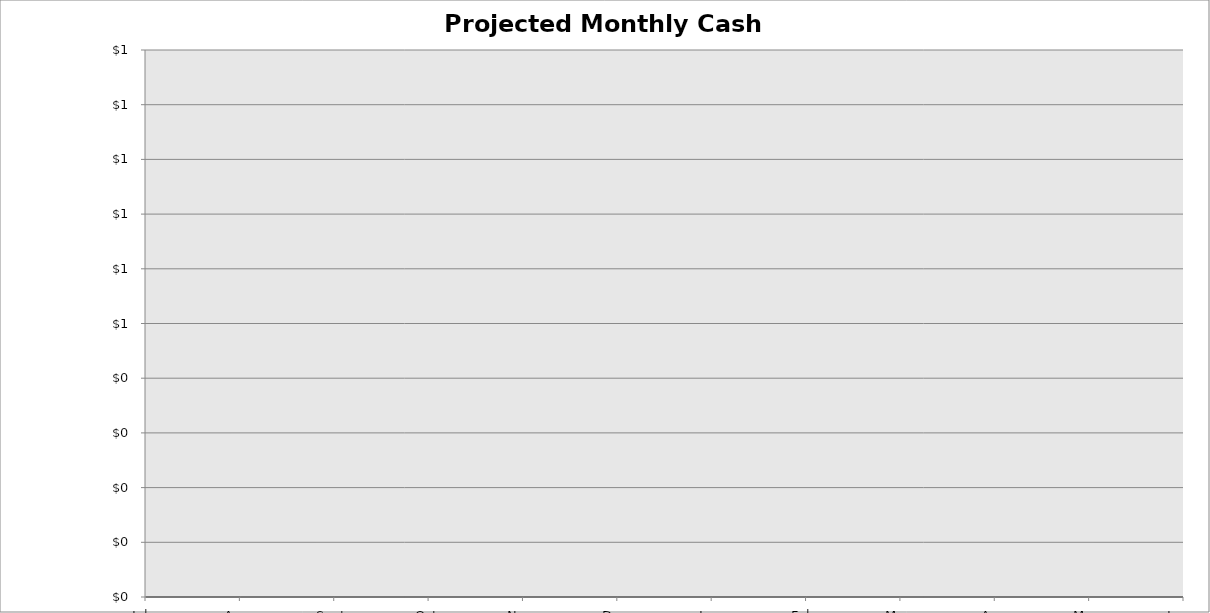
| Category | Projected Monthly Cash Balance |
|---|---|
| July | 0 |
| Aug | 0 |
| Sept | 0 |
| Oct | 0 |
| Nov | 0 |
| Dec | 0 |
| Jan | 0 |
| Feb | 0 |
| Mar | 0 |
| Apr | 0 |
| May | 0 |
| June | 0 |